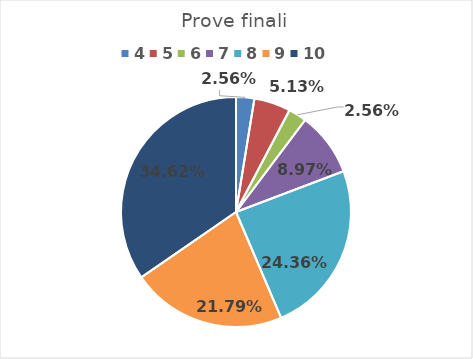
| Category | Series 0 |
|---|---|
| 4.0 | 0.026 |
| 5.0 | 0.051 |
| 6.0 | 0.026 |
| 7.0 | 0.09 |
| 8.0 | 0.244 |
| 9.0 | 0.218 |
| 10.0 | 0.346 |